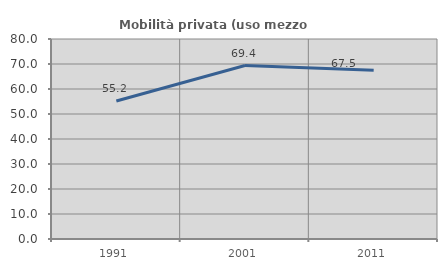
| Category | Mobilità privata (uso mezzo privato) |
|---|---|
| 1991.0 | 55.226 |
| 2001.0 | 69.383 |
| 2011.0 | 67.521 |